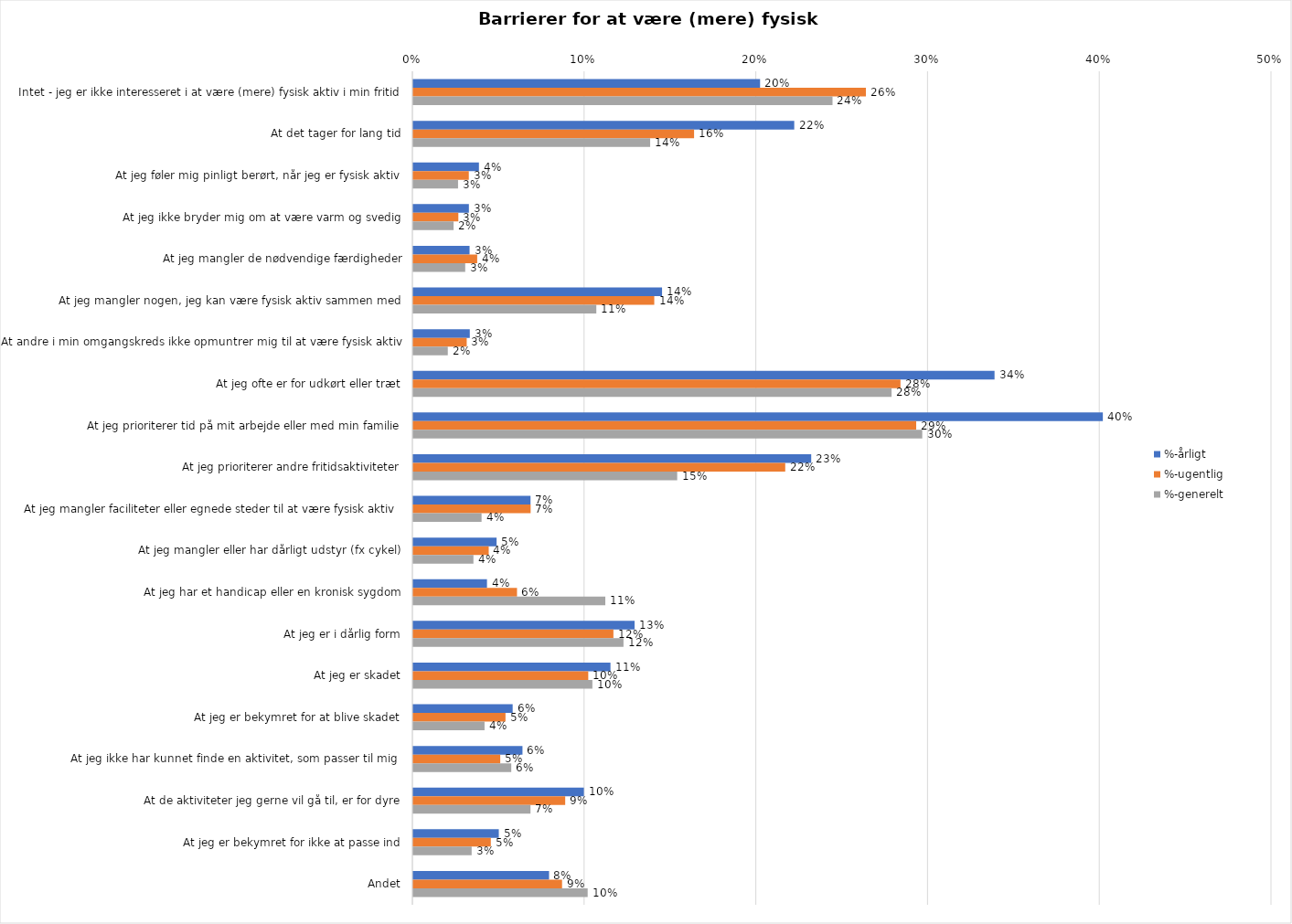
| Category | %-årligt | %-ugentlig | %-generelt |
|---|---|---|---|
| Intet - jeg er ikke interesseret i at være (mere) fysisk aktiv i min fritid | 0.202 | 0.264 | 0.244 |
| At det tager for lang tid | 0.222 | 0.164 | 0.138 |
| At jeg føler mig pinligt berørt, når jeg er fysisk aktiv | 0.038 | 0.032 | 0.026 |
| At jeg ikke bryder mig om at være varm og svedig | 0.032 | 0.026 | 0.023 |
| At jeg mangler de nødvendige færdigheder | 0.033 | 0.037 | 0.03 |
| At jeg mangler nogen, jeg kan være fysisk aktiv sammen med | 0.145 | 0.14 | 0.107 |
| At andre i min omgangskreds ikke opmuntrer mig til at være fysisk aktiv | 0.033 | 0.031 | 0.02 |
| At jeg ofte er for udkørt eller træt | 0.338 | 0.284 | 0.279 |
| At jeg prioriterer tid på mit arbejde eller med min familie | 0.402 | 0.293 | 0.296 |
| At jeg prioriterer andre fritidsaktiviteter | 0.232 | 0.217 | 0.154 |
| At jeg mangler faciliteter eller egnede steder til at være fysisk aktiv  | 0.068 | 0.068 | 0.04 |
| At jeg mangler eller har dårligt udstyr (fx cykel) | 0.049 | 0.044 | 0.035 |
| At jeg har et handicap eller en kronisk sygdom | 0.043 | 0.06 | 0.112 |
| At jeg er i dårlig form | 0.129 | 0.117 | 0.122 |
| At jeg er skadet | 0.115 | 0.102 | 0.104 |
| At jeg er bekymret for at blive skadet | 0.058 | 0.054 | 0.041 |
| At jeg ikke har kunnet finde en aktivitet, som passer til mig  | 0.064 | 0.051 | 0.057 |
| At de aktiviteter jeg gerne vil gå til, er for dyre | 0.099 | 0.088 | 0.068 |
| At jeg er bekymret for ikke at passe ind | 0.05 | 0.045 | 0.034 |
| Andet | 0.079 | 0.087 | 0.102 |